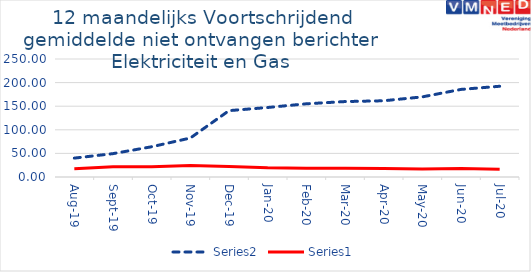
| Category | Series 3 | Series 0 |
|---|---|---|
| 2019-08-01 | 40 | 17.583 |
| 2019-09-01 | 49.5 | 21.667 |
| 2019-10-01 | 64.083 | 21.917 |
| 2019-11-01 | 82.583 | 24.333 |
| 2019-12-01 | 140.583 | 22.333 |
| 2020-01-01 | 147.25 | 19.5 |
| 2020-02-01 | 155.083 | 18.667 |
| 2020-03-01 | 159.833 | 18.667 |
| 2020-04-01 | 161.5 | 17.75 |
| 2020-05-01 | 169.75 | 16.75 |
| 2020-06-01 | 185.583 | 17.75 |
| 2020-07-01 | 192.25 | 16.25 |